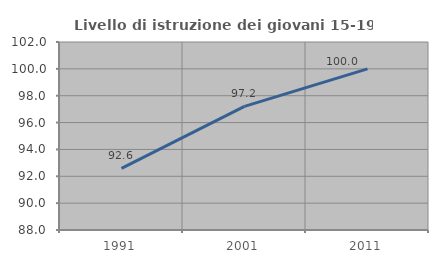
| Category | Livello di istruzione dei giovani 15-19 anni |
|---|---|
| 1991.0 | 92.593 |
| 2001.0 | 97.203 |
| 2011.0 | 100 |